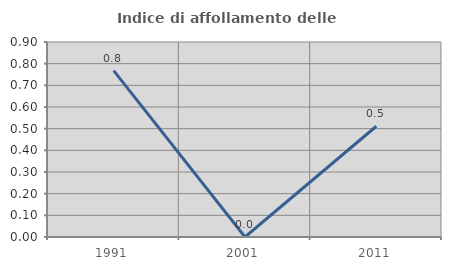
| Category | Indice di affollamento delle abitazioni  |
|---|---|
| 1991.0 | 0.768 |
| 2001.0 | 0 |
| 2011.0 | 0.511 |